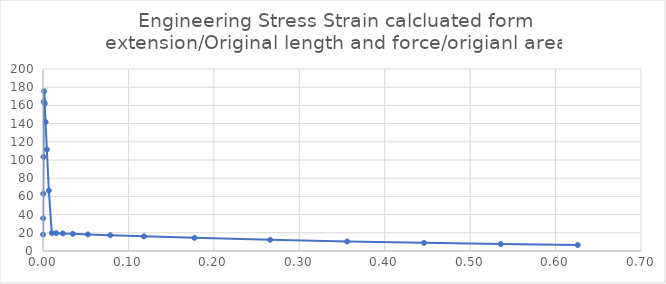
| Category | Series 0 |
|---|---|
| 9e-05 | 17.998 |
| 0.00018 | 35.993 |
| 0.000315 | 62.979 |
| 0.0005175 | 103.443 |
| 0.00082125 | 164.106 |
| 0.00127688 | 175.504 |
| 0.00196031 | 161.981 |
| 0.00298547 | 141.746 |
| 0.0045232 | 111.509 |
| 0.0068298 | 66.407 |
| 0.0102897 | 19.777 |
| 0.0154796 | 19.579 |
| 0.0232643 | 19.286 |
| 0.0349415 | 18.857 |
| 0.0524573 | 18.234 |
| 0.0787309 | 17.346 |
| 0.118141 | 16.108 |
| 0.177257 | 14.439 |
| 0.265931 | 12.289 |
| 0.355931 | 10.47 |
| 0.445931 | 8.94 |
| 0.535931 | 7.64 |
| 0.625931 | 6.527 |